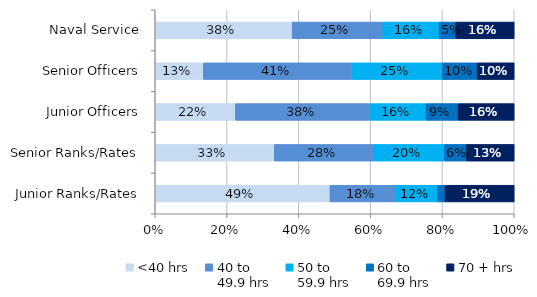
| Category | <40 hrs | 40 to 
49.9 hrs | 50 to 
59.9 hrs | 60 to 
69.9 hrs | 70 + hrs |
|---|---|---|---|---|---|
| Naval Service | 0.382 | 0.252 | 0.157 | 0.046 | 0.163 |
| Senior Officers | 0.134 | 0.414 | 0.251 | 0.097 | 0.104 |
| Junior Officers | 0.223 | 0.375 | 0.156 | 0.089 | 0.156 |
| Senior Ranks/Rates | 0.331 | 0.276 | 0.198 | 0.061 | 0.133 |
| Junior Ranks/Rates | 0.487 | 0.185 | 0.115 | 0.02 | 0.193 |